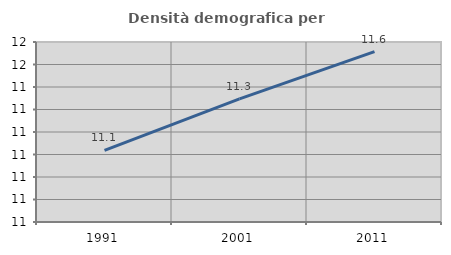
| Category | Densità demografica |
|---|---|
| 1991.0 | 11.119 |
| 2001.0 | 11.347 |
| 2011.0 | 11.557 |